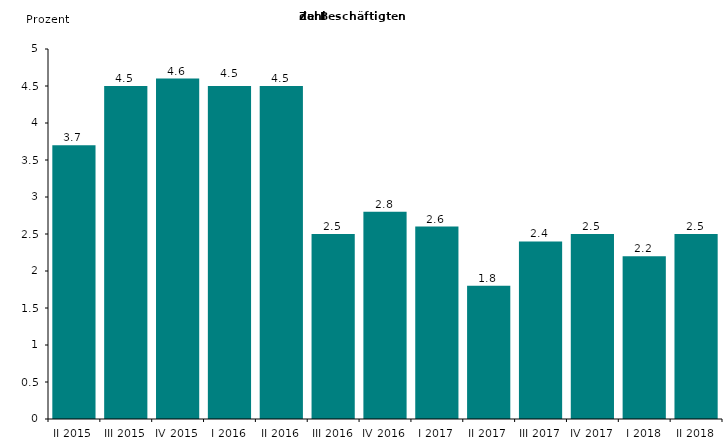
| Category | Series 0 |
|---|---|
| II 2015 | 3.7 |
| III 2015 | 4.5 |
| IV 2015 | 4.6 |
| I 2016 | 4.5 |
| II 2016 | 4.5 |
| III 2016 | 2.5 |
| IV 2016 | 2.8 |
| I 2017 | 2.6 |
| II 2017 | 1.8 |
| III 2017 | 2.4 |
| IV 2017 | 2.5 |
| I 2018 | 2.2 |
| II 2018 | 2.5 |